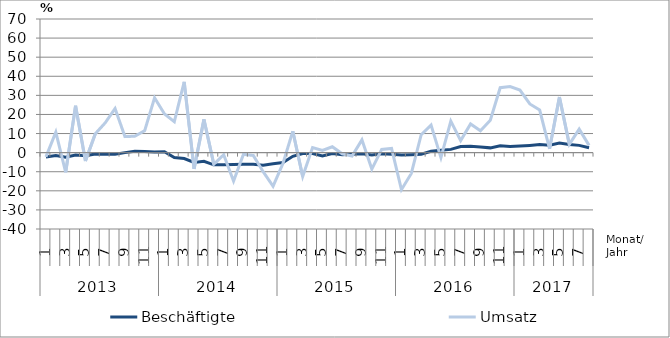
| Category | Beschäftigte | Umsatz |
|---|---|---|
| 0 | -2.3 | -2.2 |
| 1 | -1.5 | 10.7 |
| 2 | -2.4 | -10.3 |
| 3 | -1.3 | 24.6 |
| 4 | -1.6 | -4.4 |
| 5 | -0.7 | 9.9 |
| 6 | -0.8 | 15.6 |
| 7 | -0.8 | 23.1 |
| 8 | 0 | 8.4 |
| 9 | 0.7 | 8.6 |
| 10 | 0.6 | 11.5 |
| 11 | 0.3 | 28.7 |
| 12 | 0.5 | 20.3 |
| 13 | -2.6 | 16.2 |
| 14 | -3.1 | 37.1 |
| 15 | -5.1 | -8.5 |
| 16 | -4.5 | 17.4 |
| 17 | -6.4 | -6.1 |
| 18 | -6.4 | -1.1 |
| 19 | -6.2 | -14.9 |
| 20 | -6.1 | -0.9 |
| 21 | -6.1 | -1.5 |
| 22 | -6.6 | -10 |
| 23 | -5.8 | -17.6 |
| 24 | -5.2 | -5.7 |
| 25 | -1.9 | 11.2 |
| 26 | -0.5 | -12.5 |
| 27 | -0.5 | 2.7 |
| 28 | -1.7 | 1.2 |
| 29 | -0.5 | 3.1 |
| 30 | -1.1 | -0.6 |
| 31 | -0.8 | -1.8 |
| 32 | -0.6 | 6.7 |
| 33 | -1.2 | -8.6 |
| 34 | -0.6 | 1.7 |
| 35 | -0.9 | 2.2 |
| 36 | -1.3 | -19.4 |
| 37 | -1.1 | -10.9 |
| 38 | -0.8 | 9.4 |
| 39 | 0.7 | 14.4 |
| 40 | 1.2 | -2.6 |
| 41 | 1.7 | 16.5 |
| 42 | 3.2 | 6.3 |
| 43 | 3.4 | 15 |
| 44 | 3 | 11.5 |
| 45 | 2.5 | 17 |
| 46 | 3.6 | 34 |
| 47 | 3.2 | 34.6 |
| 48 | 3.5 | 32.8 |
| 49 | 3.8 | 25.5 |
| 50 | 4.2 | 22.3 |
| 51 | 3.9 | 2 |
| 52 | 5 | 29.1 |
| 53 | 4.3 | 4.3 |
| 54 | 3.8 | 12.3 |
| 55 | 2.6 | 3.8 |